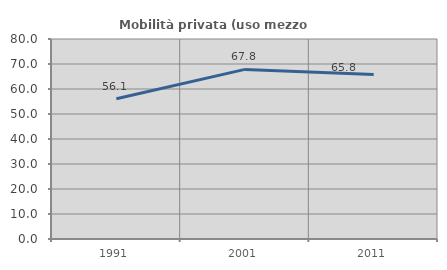
| Category | Mobilità privata (uso mezzo privato) |
|---|---|
| 1991.0 | 56.077 |
| 2001.0 | 67.849 |
| 2011.0 | 65.808 |